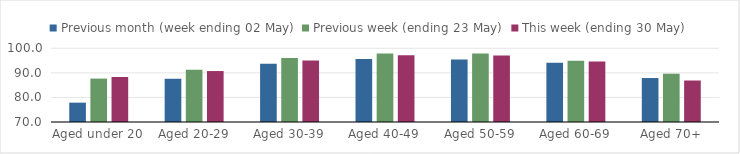
| Category | Previous month (week ending 02 May) | Previous week (ending 23 May) | This week (ending 30 May) |
|---|---|---|---|
| Aged under 20 | 77.876 | 87.666 | 88.32 |
| Aged 20-29 | 87.6 | 91.307 | 90.738 |
| Aged 30-39 | 93.738 | 96.07 | 94.984 |
| Aged 40-49 | 95.677 | 97.843 | 97.126 |
| Aged 50-59 | 95.389 | 97.884 | 97.056 |
| Aged 60-69 | 94.071 | 94.887 | 94.594 |
| Aged 70+ | 87.895 | 89.659 | 86.888 |